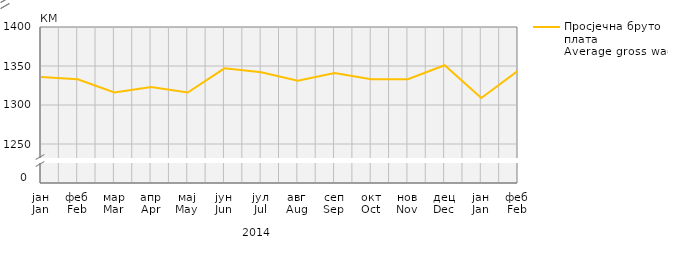
| Category | Просјечна бруто плата
Average gross wage |
|---|---|
| јан
Jan | 1336 |
| феб
Feb | 1333 |
| мар
Mar | 1316 |
| апр
Apr | 1323 |
| мај
May | 1316 |
| јун
Jun | 1347 |
| јул
Jul | 1342 |
| авг
Aug | 1331 |
| сеп
Sep | 1341 |
| окт
Oct | 1333 |
| нов
Nov | 1333 |
| дец
Dec | 1351 |
| јан
Jan | 1309 |
| феб
Feb | 1344 |